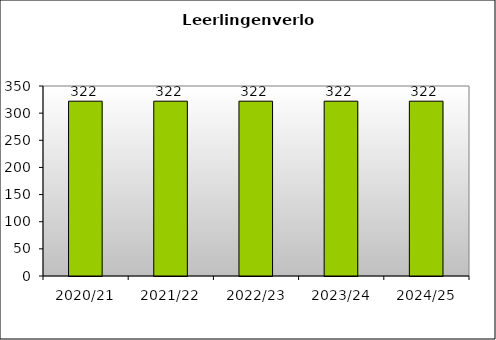
| Category | Series 0 |
|---|---|
| 2020/21 | 322 |
| 2021/22 | 322 |
| 2022/23 | 322 |
| 2023/24 | 322 |
| 2024/25 | 322 |